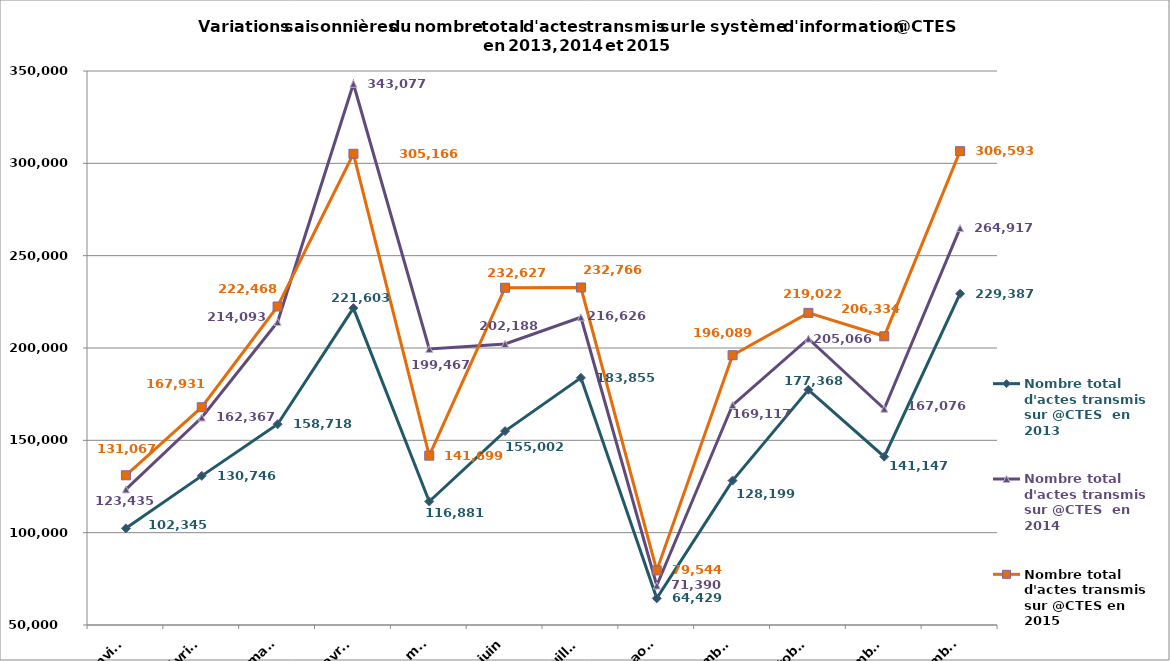
| Category | Nombre total d'actes transmis sur @CTES  en 2013 | Nombre total d'actes transmis sur @CTES  en 2014 | Nombre total d'actes transmis sur @CTES en 2015 |
|---|---|---|---|
| janvier | 102345 | 123435 | 131067 |
| février | 130746 | 162367 | 167931 |
| mars | 158718 | 214093 | 222468 |
| avril | 221603 | 343077 | 305166 |
| mai | 116881 | 199467 | 141699 |
| juin | 155002 | 202188 | 232627 |
| juillet | 183855 | 216626 | 232766 |
| août | 64429 | 71390 | 79544 |
| septembre | 128199 | 169117 | 196089 |
| octobre | 177368 | 205066 | 219022 |
| novembre | 141147 | 167076 | 206334 |
| décembre | 229387 | 264917 | 306593 |